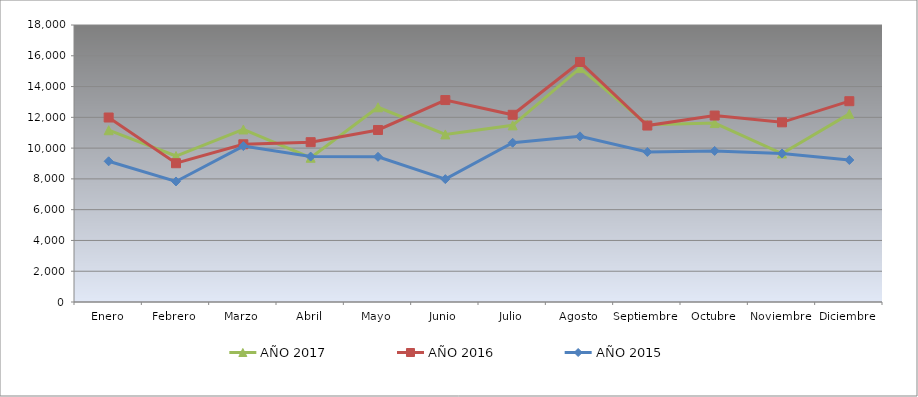
| Category | AÑO 2017 | AÑO 2016 | AÑO 2015 |
|---|---|---|---|
| Enero | 11163.056 | 11988.484 | 9142.656 |
| Febrero | 9486.008 | 9017.52 | 7831.585 |
| Marzo | 11211.538 | 10249.064 | 10131.919 |
| Abril | 9373.617 | 10385.297 | 9450.712 |
| Mayo | 12652.786 | 11177.627 | 9435.126 |
| Junio | 10888.69 | 13123.031 | 7985.613 |
| Julio | 11479.293 | 12165.042 | 10349.208 |
| Agosto | 15199.21 | 15598.108 | 10764.533 |
| Septiembre | 11523.368 | 11466.44 | 9750.516 |
| Octubre | 11626.944 | 12115.998 | 9817.445 |
| Noviembre | 9646.881 | 11674.604 | 9653.332 |
| Diciembre | 12226.362 | 13048.92 | 9227.005 |